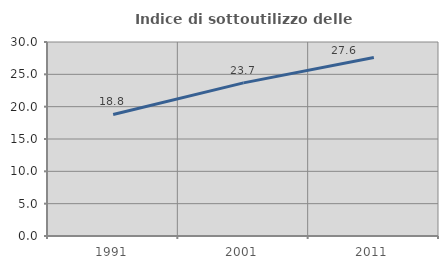
| Category | Indice di sottoutilizzo delle abitazioni  |
|---|---|
| 1991.0 | 18.799 |
| 2001.0 | 23.683 |
| 2011.0 | 27.601 |